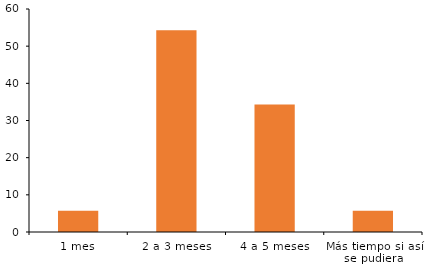
| Category | Respuestas |
|---|---|
| 0 | 5.714 |
| 1 | 54.286 |
| 2 | 34.286 |
| 3 | 5.714 |